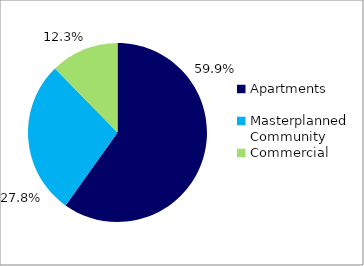
| Category | Series 0 |
|---|---|
| Apartments | 0.599 |
| Masterplanned Community | 0.278 |
| Commercial | 0.123 |